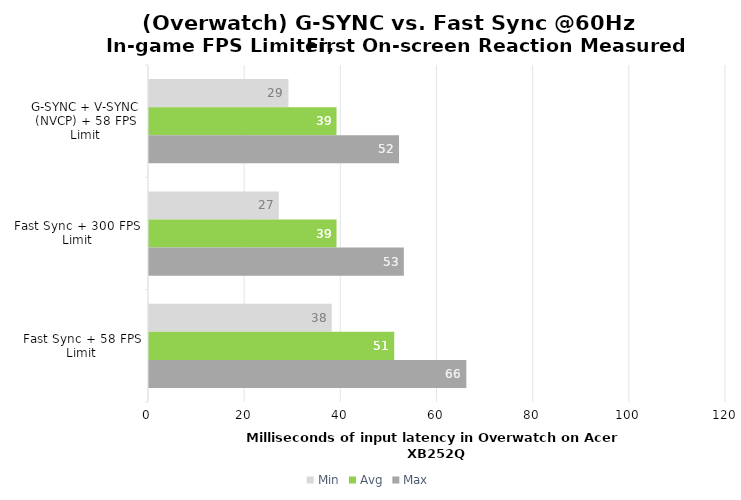
| Category | Min | Avg | Max |
|---|---|---|---|
| G-SYNC + V-SYNC (NVCP) + 58 FPS Limit | 29 | 39 | 52 |
| Fast Sync + 300 FPS Limit | 27 | 39 | 53 |
| Fast Sync + 58 FPS Limit | 38 | 51 | 66 |